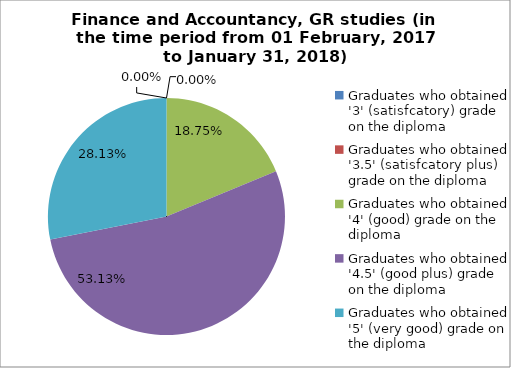
| Category | Series 0 |
|---|---|
| Graduates who obtained '3' (satisfcatory) grade on the diploma | 0 |
| Graduates who obtained '3.5' (satisfcatory plus) grade on the diploma | 0 |
| Graduates who obtained '4' (good) grade on the diploma | 18.75 |
| Graduates who obtained '4.5' (good plus) grade on the diploma | 53.125 |
| Graduates who obtained '5' (very good) grade on the diploma | 28.125 |